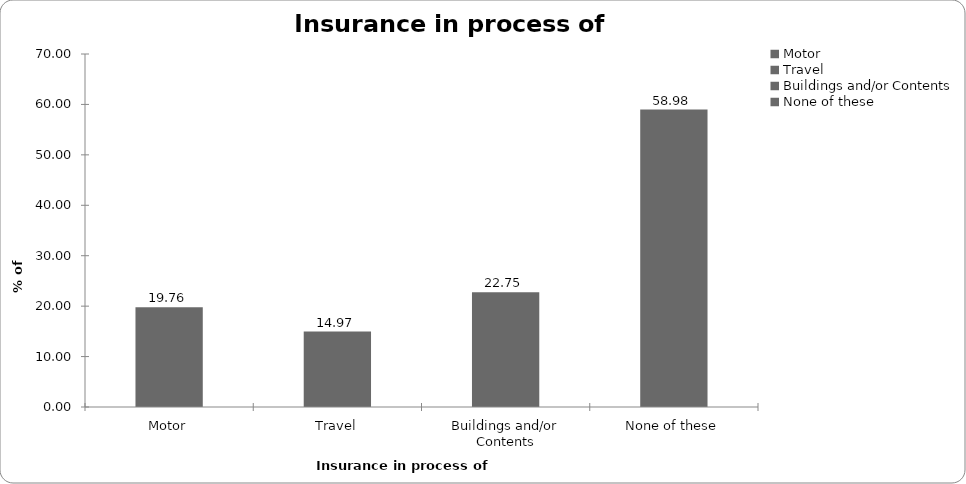
| Category | Insurance in process of buying |
|---|---|
| Motor | 19.76 |
| Travel | 14.97 |
| Buildings and/or Contents | 22.754 |
| None of these | 58.982 |